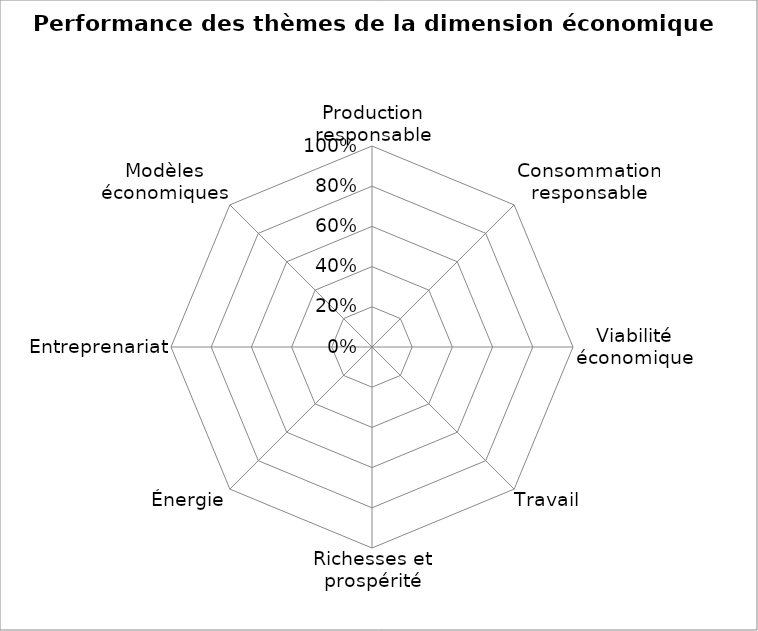
| Category | Series 0 |
|---|---|
| Production responsable | 0 |
| Consommation responsable | 0 |
| Viabilité économique | 0 |
| Travail | 0 |
| Richesses et prospérité | 0 |
| Énergie | 0 |
| Entreprenariat | 0 |
| Modèles économiques | 0 |